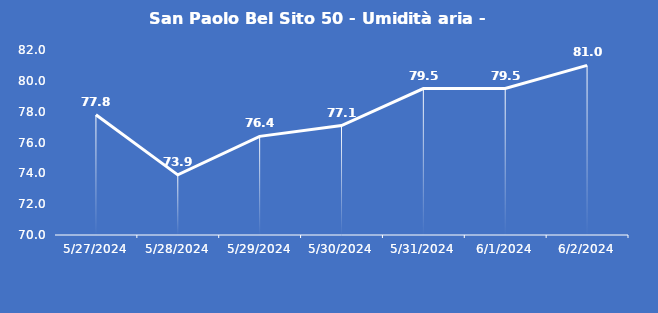
| Category | San Paolo Bel Sito 50 - Umidità aria - Grezzo (%) |
|---|---|
| 5/27/24 | 77.8 |
| 5/28/24 | 73.9 |
| 5/29/24 | 76.4 |
| 5/30/24 | 77.1 |
| 5/31/24 | 79.5 |
| 6/1/24 | 79.5 |
| 6/2/24 | 81 |